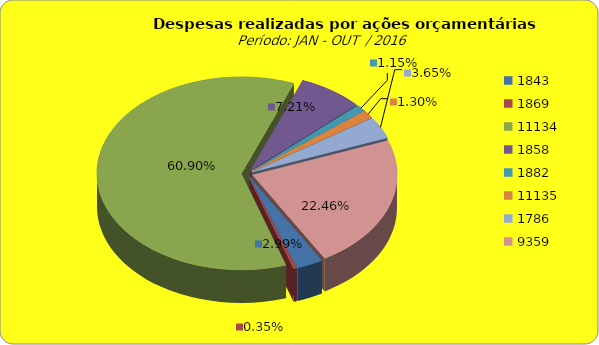
| Category | Series 1 |
|---|---|
| 1843.0 | 6032938.25 |
| 1869.0 | 697574.66 |
| 11134.0 | 123067041.24 |
| 1858.0 | 14570807.19 |
| 1882.0 | 2330908.46 |
| 11135.0 | 2636843.88 |
| 1786.0 | 7369518.93 |
| 9359.0 | 45380819.27 |